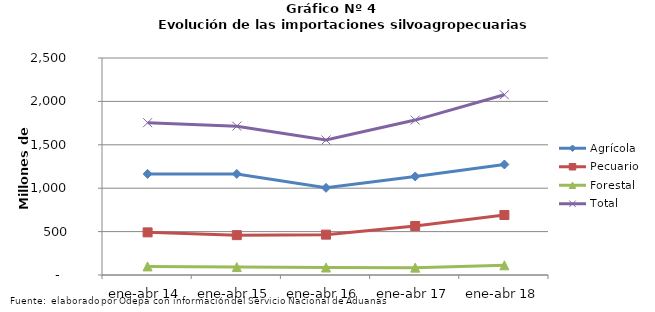
| Category | Agrícola | Pecuario | Forestal | Total |
|---|---|---|---|---|
| ene-abr 14 | 1164693 | 491084 | 99119 | 1754896 |
| ene-abr 15 | 1164472 | 459154 | 91306 | 1714932 |
| ene-abr 16 | 1004451 | 464809 | 86209 | 1555469 |
| ene-abr 17 | 1135265 | 564640 | 84838 | 1784743 |
| ene-abr 18 | 1273413 | 691419 | 111489 | 2076321 |